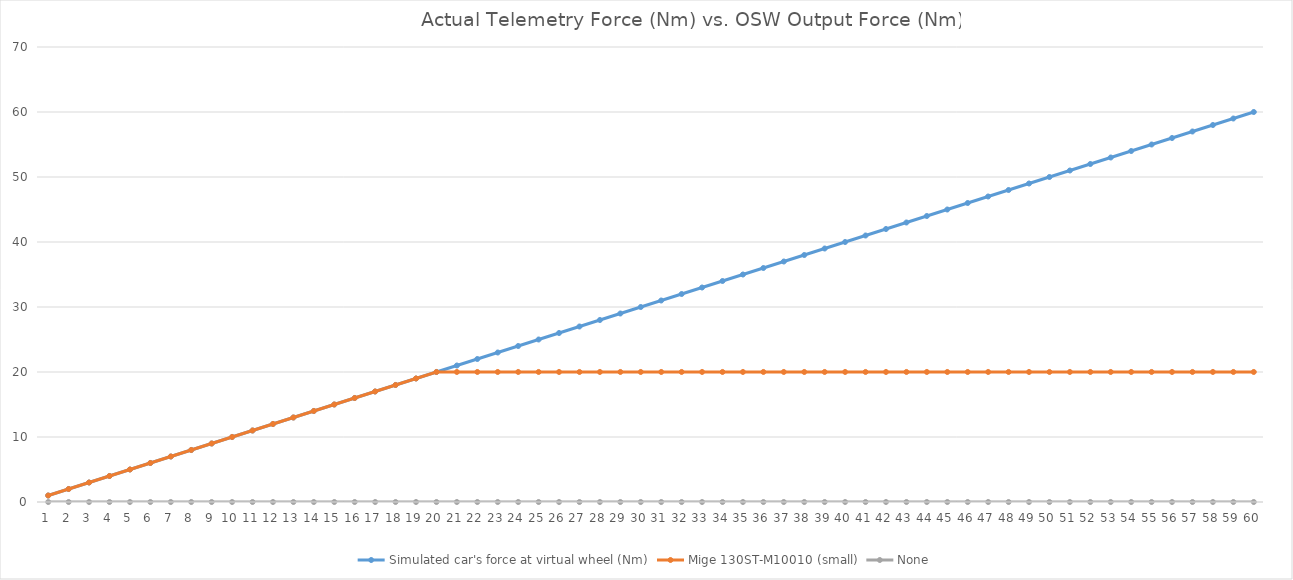
| Category | Simulated car's force at virtual wheel (Nm) | Mige 130ST-M10010 (small) | None |
|---|---|---|---|
| 0 | 1 | 1 | 0 |
| 1 | 2 | 2.001 | 0 |
| 2 | 3 | 3.001 | 0 |
| 3 | 4 | 4.001 | 0 |
| 4 | 5 | 5.001 | 0 |
| 5 | 6 | 6.002 | 0 |
| 6 | 7 | 7.002 | 0 |
| 7 | 8 | 8.002 | 0 |
| 8 | 9 | 9.003 | 0 |
| 9 | 10 | 10.003 | 0 |
| 10 | 11 | 11.003 | 0 |
| 11 | 12 | 12.003 | 0 |
| 12 | 13 | 13.004 | 0 |
| 13 | 14 | 14.004 | 0 |
| 14 | 15 | 15.004 | 0 |
| 15 | 16 | 16.005 | 0 |
| 16 | 17 | 17.005 | 0 |
| 17 | 18 | 18.005 | 0 |
| 18 | 19 | 19.005 | 0 |
| 19 | 20 | 20.006 | 0 |
| 20 | 21 | 20.006 | 0 |
| 21 | 22 | 20.006 | 0 |
| 22 | 23 | 20.006 | 0 |
| 23 | 24 | 20.006 | 0 |
| 24 | 25 | 20.006 | 0 |
| 25 | 26 | 20.006 | 0 |
| 26 | 27 | 20.006 | 0 |
| 27 | 28 | 20.006 | 0 |
| 28 | 29 | 20.006 | 0 |
| 29 | 30 | 20.006 | 0 |
| 30 | 31 | 20.006 | 0 |
| 31 | 32 | 20.006 | 0 |
| 32 | 33 | 20.006 | 0 |
| 33 | 34 | 20.006 | 0 |
| 34 | 35 | 20.006 | 0 |
| 35 | 36 | 20.006 | 0 |
| 36 | 37 | 20.006 | 0 |
| 37 | 38 | 20.006 | 0 |
| 38 | 39 | 20.006 | 0 |
| 39 | 40 | 20.006 | 0 |
| 40 | 41 | 20.006 | 0 |
| 41 | 42 | 20.006 | 0 |
| 42 | 43 | 20.006 | 0 |
| 43 | 44 | 20.006 | 0 |
| 44 | 45 | 20.006 | 0 |
| 45 | 46 | 20.006 | 0 |
| 46 | 47 | 20.006 | 0 |
| 47 | 48 | 20.006 | 0 |
| 48 | 49 | 20.006 | 0 |
| 49 | 50 | 20.006 | 0 |
| 50 | 51 | 20.006 | 0 |
| 51 | 52 | 20.006 | 0 |
| 52 | 53 | 20.006 | 0 |
| 53 | 54 | 20.006 | 0 |
| 54 | 55 | 20.006 | 0 |
| 55 | 56 | 20.006 | 0 |
| 56 | 57 | 20.006 | 0 |
| 57 | 58 | 20.006 | 0 |
| 58 | 59 | 20.006 | 0 |
| 59 | 60 | 20.006 | 0 |